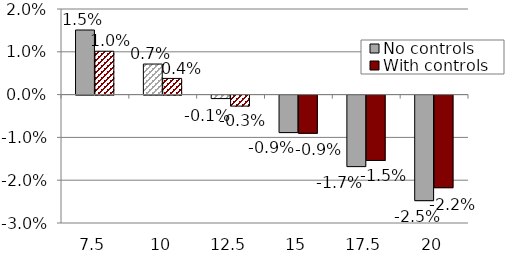
| Category | No controls | With controls |
|---|---|---|
| 7.5 | 0.015 | 0.01 |
| 10.0 | 0.007 | 0.004 |
| 12.5 | -0.001 | -0.003 |
| 15.0 | -0.009 | -0.009 |
| 17.5 | -0.017 | -0.015 |
| 20.0 | -0.025 | -0.022 |